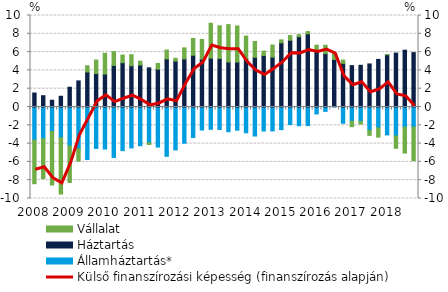
| Category | Államháztartás* | Háztartás | Vállalat |
|---|---|---|---|
| 2008.0 | -3.614 | 1.526 | -4.77 |
| nan | -3.465 | 1.235 | -4.353 |
| nan | -2.667 | 0.739 | -5.861 |
| nan | -3.365 | 1.174 | -6.149 |
| 2009.0 | -4.26 | 2.16 | -3.987 |
| nan | -4.568 | 2.85 | -1.346 |
| nan | -5.737 | 3.828 | 0.678 |
| nan | -4.523 | 3.656 | 1.48 |
| 2010.0 | -4.596 | 3.6 | 2.266 |
| nan | -5.515 | 4.545 | 1.5 |
| nan | -4.769 | 4.842 | 0.832 |
| nan | -4.478 | 4.507 | 1.208 |
| 2011.0 | -4.232 | 4.596 | 0.413 |
| nan | -3.914 | 4.279 | -0.187 |
| nan | -4.378 | 4.137 | 0.626 |
| nan | -5.386 | 5.263 | 0.962 |
| 2012.0 | -4.694 | 5.019 | 0.303 |
| nan | -3.959 | 5.257 | 1.203 |
| nan | -3.339 | 5.653 | 1.84 |
| nan | -2.511 | 5.231 | 2.147 |
| 2013.0 | -2.438 | 5.341 | 3.812 |
| nan | -2.452 | 5.303 | 3.569 |
| nan | -2.704 | 4.913 | 4.093 |
| nan | -2.534 | 4.912 | 3.942 |
| 2014.0 | -2.818 | 5.3 | 2.454 |
| nan | -3.173 | 5.431 | 1.734 |
| nan | -2.623 | 5.628 | 0.485 |
| nan | -2.614 | 5.443 | 1.332 |
| 2015.0 | -2.474 | 7.012 | 0.329 |
| nan | -1.926 | 7.294 | 0.514 |
| nan | -2.045 | 7.68 | 0.226 |
| nan | -2.032 | 7.997 | 0.251 |
| 2016.0 | -0.754 | 6.134 | 0.629 |
| nan | -0.479 | 5.834 | 0.916 |
| nan | 0.035 | 5.168 | 0.627 |
| nan | -1.777 | 4.77 | 0.362 |
| 2017.0 | -1.56 | 4.522 | -0.589 |
| nan | -1.572 | 4.558 | -0.292 |
| nan | -2.559 | 4.707 | -0.538 |
| nan | -2.279 | 5.205 | -1.013 |
| 2018.0 | -3.051 | 5.711 | 0.025 |
| nan | -3.169 | 5.891 | -1.346 |
| nan | -2.205 | 6.21 | -2.831 |
| nan | -2.199 | 5.942 | -3.661 |